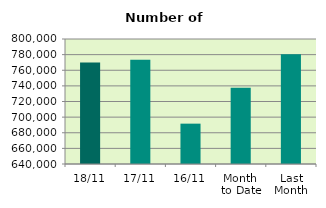
| Category | Series 0 |
|---|---|
| 18/11 | 769914 |
| 17/11 | 773460 |
| 16/11 | 691646 |
| Month 
to Date | 737468.857 |
| Last
Month | 780428.952 |